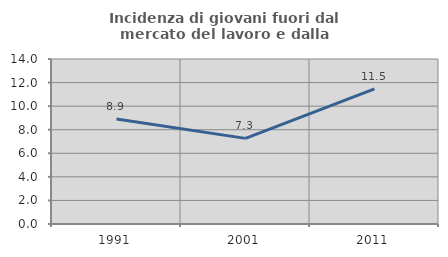
| Category | Incidenza di giovani fuori dal mercato del lavoro e dalla formazione  |
|---|---|
| 1991.0 | 8.917 |
| 2001.0 | 7.266 |
| 2011.0 | 11.458 |